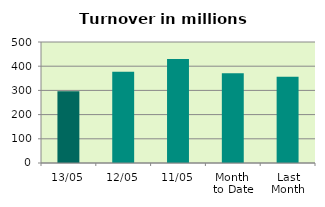
| Category | Series 0 |
|---|---|
| 13/05 | 296.43 |
| 12/05 | 377.084 |
| 11/05 | 430.26 |
| Month 
to Date | 370.545 |
| Last
Month | 356.105 |